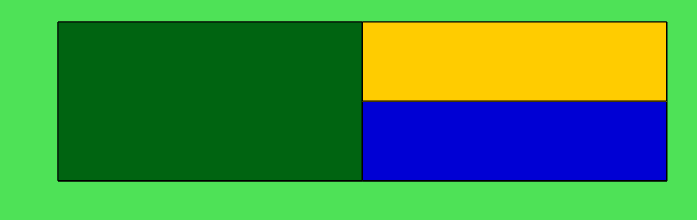
| Category | Series 0 | Series 1 |
|---|---|---|
| 0 | 1 | 0 |
| 1 | 0.5 | 0.5 |